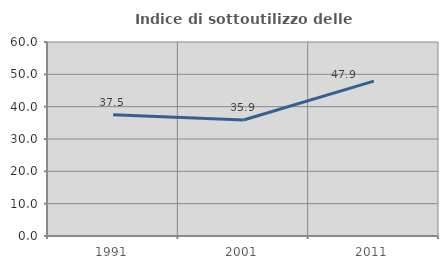
| Category | Indice di sottoutilizzo delle abitazioni  |
|---|---|
| 1991.0 | 37.481 |
| 2001.0 | 35.882 |
| 2011.0 | 47.894 |